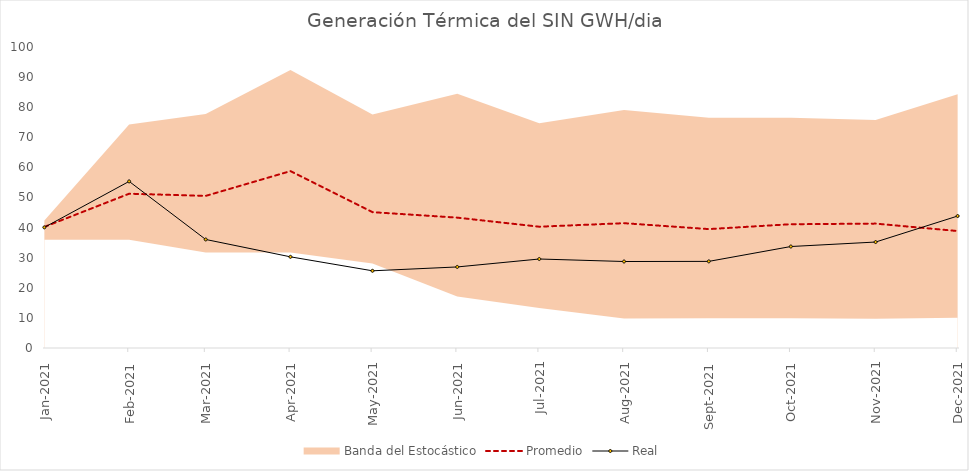
| Category | Promedio | Real |
|---|---|---|
| 2021-01-01 | 40.229 | 40.074 |
| 2021-02-01 | 51.254 | 55.351 |
| 2021-03-01 | 50.535 | 36.057 |
| 2021-04-01 | 58.767 | 30.285 |
| 2021-05-01 | 45.132 | 25.647 |
| 2021-06-01 | 43.31 | 26.927 |
| 2021-07-01 | 40.297 | 29.563 |
| 2021-08-01 | 41.468 | 28.737 |
| 2021-09-01 | 39.503 | 28.778 |
| 2021-10-01 | 41.123 | 33.716 |
| 2021-11-01 | 41.323 | 35.202 |
| 2021-12-01 | 38.858 | 43.841 |